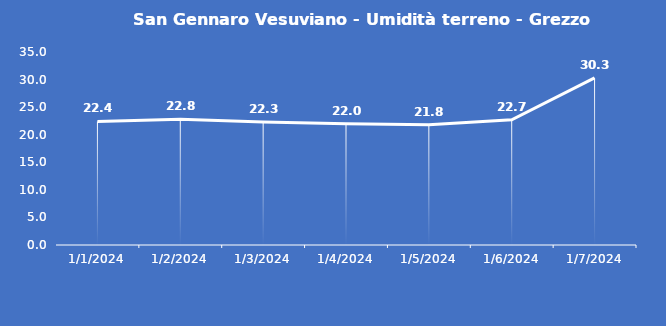
| Category | San Gennaro Vesuviano - Umidità terreno - Grezzo (%VWC) |
|---|---|
| 1/1/24 | 22.4 |
| 1/2/24 | 22.8 |
| 1/3/24 | 22.3 |
| 1/4/24 | 22 |
| 1/5/24 | 21.8 |
| 1/6/24 | 22.7 |
| 1/7/24 | 30.3 |